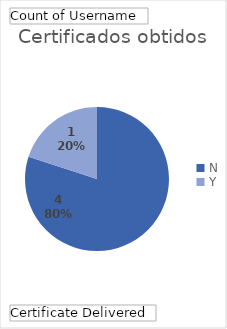
| Category | Total |
|---|---|
| N | 4 |
| Y | 1 |